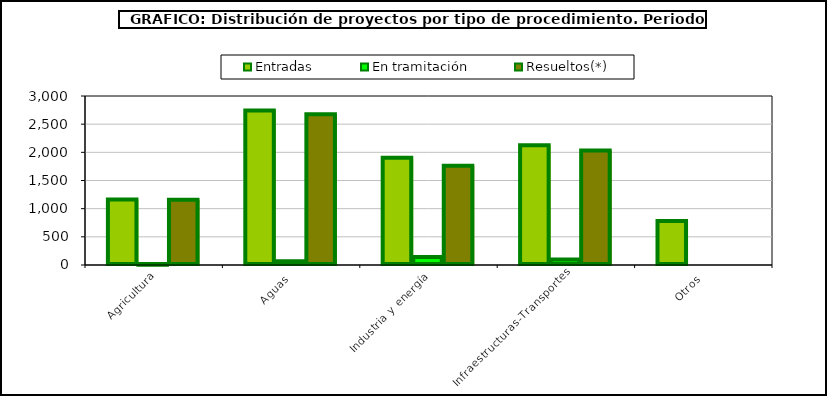
| Category | Entradas | En tramitación | Resueltos(*) |
|---|---|---|---|
| Agricultura | 1161 | 6 | 1157 |
| Aguas | 2742 | 68 | 2678 |
| Industria y energía | 1903 | 143 | 1761 |
| Infraestructuras-Transportes | 2125 | 98 | 2034 |
| Otros | 779 | 0 | 0 |